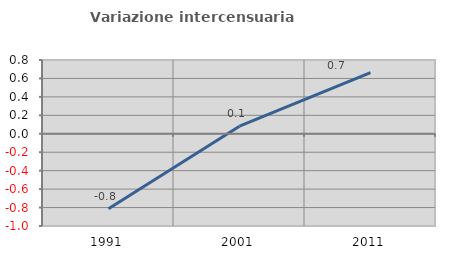
| Category | Variazione intercensuaria annua |
|---|---|
| 1991.0 | -0.814 |
| 2001.0 | 0.083 |
| 2011.0 | 0.663 |